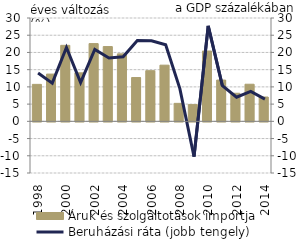
| Category | Áruk és szolgáltotások importja |
|---|---|
| 1998.0 | 10.734 |
| 1999.0 | 13.717 |
| 2000.0 | 22.064 |
| 2001.0 | 14.078 |
| 2002.0 | 22.574 |
| 2003.0 | 21.708 |
| 2004.0 | 19.59 |
| 2005.0 | 12.715 |
| 2006.0 | 14.701 |
| 2007.0 | 16.308 |
| 2008.0 | 5.222 |
| 2009.0 | 4.858 |
| 2010.0 | 20.416 |
| 2011.0 | 11.981 |
| 2012.0 | 8.153 |
| 2013.0 | 10.772 |
| 2014.0 | 7.06 |